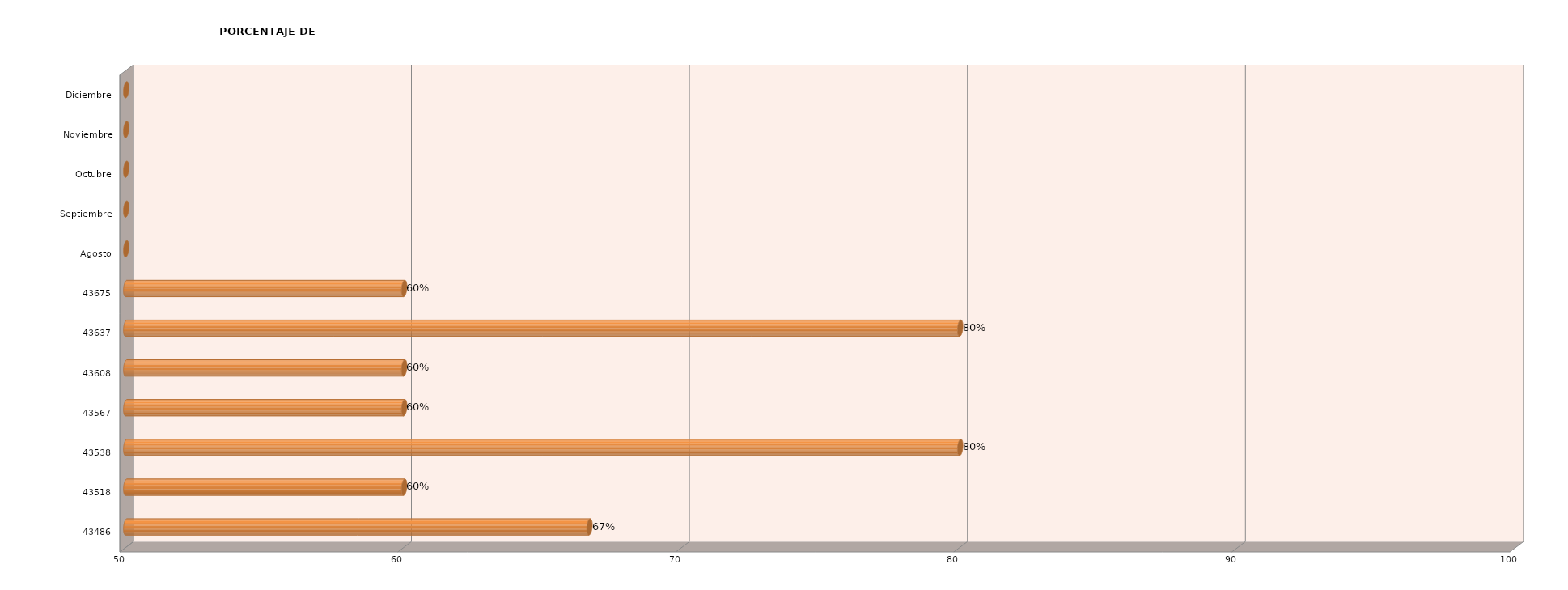
| Category | Series 0 |
|---|---|
| 43486 | 66.667 |
| 43518 | 60 |
| 43538 | 80 |
| 43567 | 60 |
| 43608 | 60 |
| 43637 | 80 |
| 43675 | 60 |
| Agosto | 0 |
| Septiembre | 0 |
| Octubre | 0 |
| Noviembre | 0 |
| Diciembre | 0 |